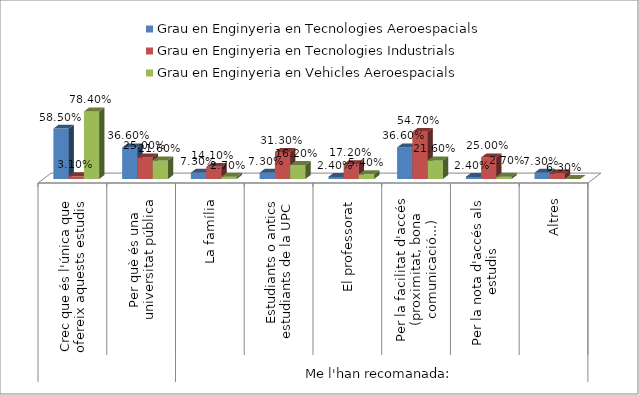
| Category | Grau en Enginyeria en Tecnologies Aeroespacials | Grau en Enginyeria en Tecnologies Industrials | Grau en Enginyeria en Vehicles Aeroespacials |
|---|---|---|---|
| 0 | 0.585 | 0.031 | 0.784 |
| 1 | 0.366 | 0.25 | 0.216 |
| 2 | 0.073 | 0.141 | 0.027 |
| 3 | 0.073 | 0.313 | 0.162 |
| 4 | 0.024 | 0.172 | 0.054 |
| 5 | 0.366 | 0.547 | 0.216 |
| 6 | 0.024 | 0.25 | 0.027 |
| 7 | 0.073 | 0.063 | 0 |